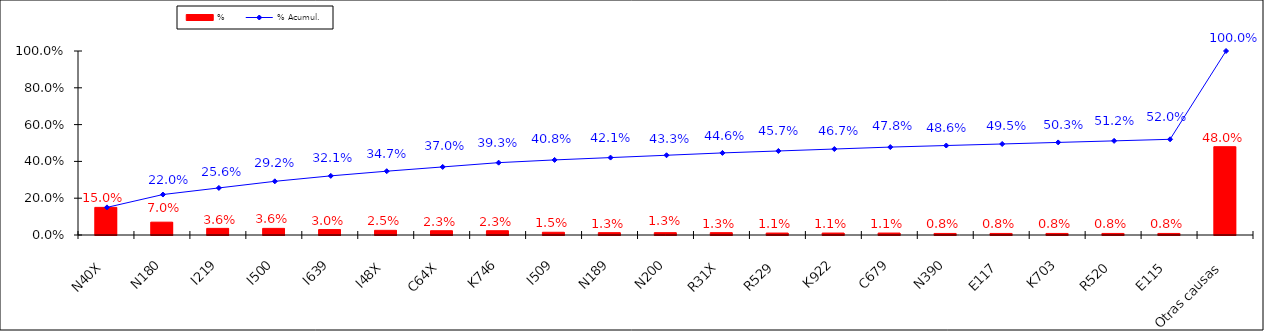
| Category | % |
|---|---|
| N40X | 0.15 |
| N180 | 0.07 |
| I219 | 0.036 |
| I500 | 0.036 |
| I639 | 0.03 |
| I48X | 0.025 |
| C64X | 0.023 |
| K746 | 0.023 |
| I509 | 0.015 |
| N189 | 0.013 |
| N200 | 0.013 |
| R31X | 0.013 |
| R529 | 0.011 |
| K922 | 0.011 |
| C679 | 0.011 |
| N390 | 0.008 |
| E117 | 0.008 |
| K703 | 0.008 |
| R520 | 0.008 |
| E115 | 0.008 |
| Otras causas | 0.48 |